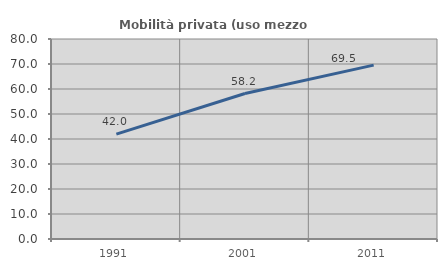
| Category | Mobilità privata (uso mezzo privato) |
|---|---|
| 1991.0 | 41.975 |
| 2001.0 | 58.182 |
| 2011.0 | 69.54 |